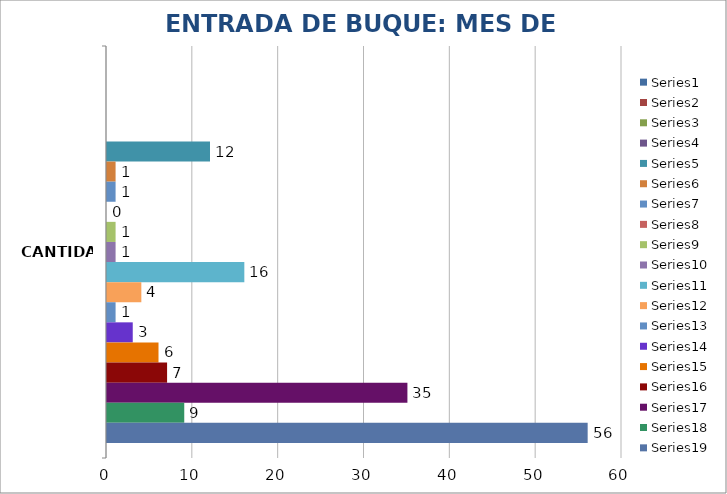
| Category | Series 0 | Series 1 | Series 2 | Series 3 | Series 4 | Series 5 | Series 6 | Series 7 | Series 8 | Series 9 | Series 10 | Series 11 | Series 12 | Series 13 | Series 14 | Series 15 | Series 16 | Series 17 | Series 18 |
|---|---|---|---|---|---|---|---|---|---|---|---|---|---|---|---|---|---|---|---|
| CANTIDAD |  |  |  |  | 12 | 1 | 1 | 0 | 1 | 1 | 16 | 4 | 1 | 3 | 6 | 7 | 35 | 9 | 56 |